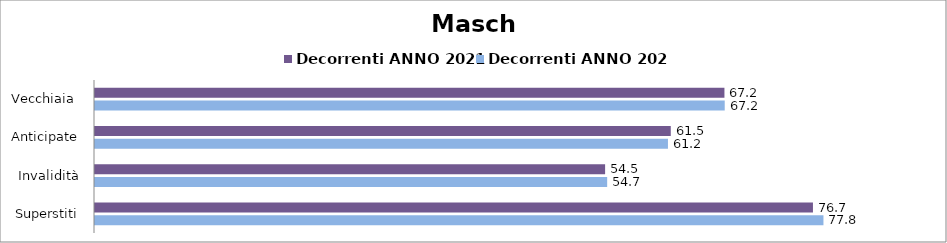
| Category | Decorrenti ANNO 2021 | Decorrenti ANNO 2022 |
|---|---|---|
| Vecchiaia  | 67.2 | 67.23 |
| Anticipate | 61.47 | 61.17 |
| Invalidità | 54.46 | 54.68 |
| Superstiti | 76.65 | 77.77 |